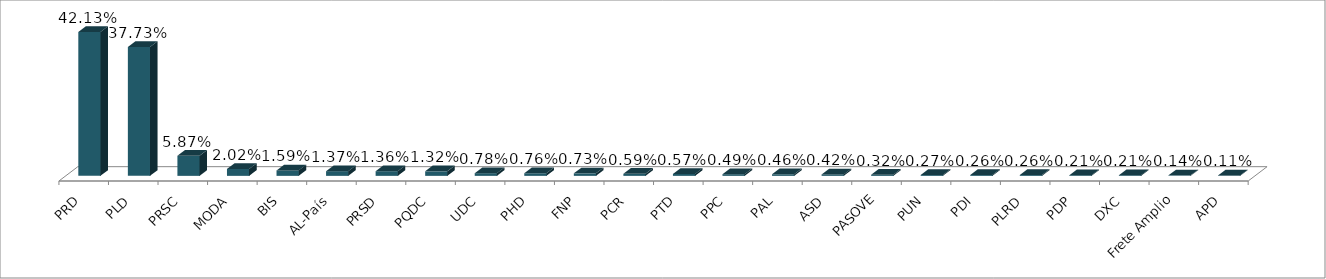
| Category | Votos % |
|---|---|
| PRD | 0.421 |
| PLD | 0.377 |
| PRSC | 0.059 |
| MODA | 0.02 |
| BIS | 0.016 |
| AL-País | 0.014 |
| PRSD | 0.014 |
| PQDC | 0.013 |
| UDC | 0.008 |
| PHD | 0.008 |
| FNP | 0.007 |
| PCR | 0.006 |
| PTD | 0.006 |
| PPC | 0.005 |
| PAL | 0.005 |
| ASD | 0.004 |
| PASOVE | 0.003 |
| PUN | 0.003 |
| PDI | 0.003 |
| PLRD | 0.003 |
| PDP | 0.002 |
| DXC | 0.002 |
| Frete Amplio | 0.001 |
| APD | 0.001 |